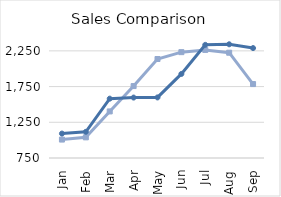
| Category | Sold 19 | Sold 20 |
|---|---|---|
| Jan | 1008 | 1092 |
| Feb | 1039 | 1116 |
| Mar | 1402 | 1581 |
| Apr | 1757 | 1596 |
| May | 2136 | 1598 |
| Jun | 2232 | 1927 |
| Jul | 2263 | 2334 |
| Aug | 2224 | 2342 |
| Sep | 1785 | 2289 |